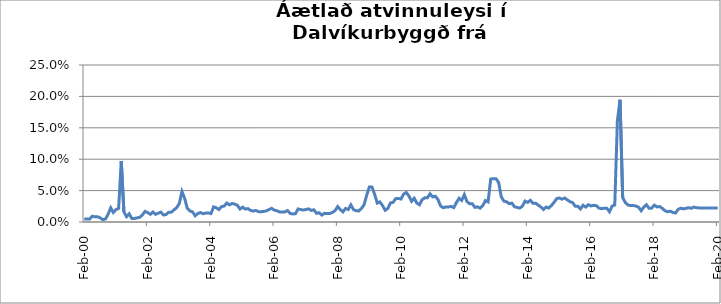
| Category | Series 0 |
|---|---|
| 2000-02-01 | 0.005 |
| 2000-03-01 | 0.005 |
| 2000-04-01 | 0.005 |
| 2000-05-01 | 0.009 |
| 2000-06-01 | 0.008 |
| 2000-07-01 | 0.008 |
| 2000-08-01 | 0.007 |
| 2000-09-01 | 0.004 |
| 2000-10-01 | 0.005 |
| 2000-11-01 | 0.012 |
| 2000-12-01 | 0.023 |
| 2001-01-01 | 0.015 |
| 2001-02-01 | 0.02 |
| 2001-03-01 | 0.022 |
| 2001-04-01 | 0.097 |
| 2001-05-01 | 0.016 |
| 2001-06-01 | 0.008 |
| 2001-07-01 | 0.013 |
| 2001-08-01 | 0.006 |
| 2001-09-01 | 0.006 |
| 2001-10-01 | 0.007 |
| 2001-11-01 | 0.007 |
| 2001-12-01 | 0.011 |
| 2002-01-01 | 0.017 |
| 2002-02-01 | 0.015 |
| 2002-03-01 | 0.012 |
| 2002-04-01 | 0.016 |
| 2002-05-01 | 0.012 |
| 2002-06-01 | 0.014 |
| 2002-07-01 | 0.016 |
| 2002-08-01 | 0.011 |
| 2002-09-01 | 0.012 |
| 2002-10-01 | 0.016 |
| 2002-11-01 | 0.016 |
| 2002-12-01 | 0.019 |
| 2003-01-01 | 0.023 |
| 2003-02-01 | 0.029 |
| 2003-03-01 | 0.049 |
| 2003-04-01 | 0.038 |
| 2003-05-01 | 0.022 |
| 2003-06-01 | 0.018 |
| 2003-07-01 | 0.016 |
| 2003-08-01 | 0.01 |
| 2003-09-01 | 0.013 |
| 2003-10-01 | 0.015 |
| 2003-11-01 | 0.013 |
| 2003-12-01 | 0.014 |
| 2004-01-01 | 0.014 |
| 2004-02-01 | 0.013 |
| 2004-03-01 | 0.024 |
| 2004-04-01 | 0.023 |
| 2004-05-01 | 0.02 |
| 2004-06-01 | 0.025 |
| 2004-07-01 | 0.025 |
| 2004-08-01 | 0.03 |
| 2004-09-01 | 0.027 |
| 2004-10-01 | 0.03 |
| 2004-11-01 | 0.029 |
| 2004-12-01 | 0.027 |
| 2005-01-01 | 0.021 |
| 2005-02-01 | 0.024 |
| 2005-03-01 | 0.021 |
| 2005-04-01 | 0.021 |
| 2005-05-01 | 0.018 |
| 2005-06-01 | 0.017 |
| 2005-07-01 | 0.018 |
| 2005-08-01 | 0.016 |
| 2005-09-01 | 0.016 |
| 2005-10-01 | 0.017 |
| 2005-11-01 | 0.018 |
| 2005-12-01 | 0.02 |
| 2006-01-01 | 0.022 |
| 2006-02-01 | 0.019 |
| 2006-03-01 | 0.018 |
| 2006-04-01 | 0.016 |
| 2006-05-01 | 0.016 |
| 2006-06-01 | 0.016 |
| 2006-07-01 | 0.018 |
| 2006-08-01 | 0.014 |
| 2006-09-01 | 0.013 |
| 2006-10-01 | 0.013 |
| 2006-11-01 | 0.021 |
| 2006-12-01 | 0.02 |
| 2007-01-01 | 0.019 |
| 2007-02-01 | 0.02 |
| 2007-03-01 | 0.021 |
| 2007-04-01 | 0.018 |
| 2007-05-01 | 0.019 |
| 2007-06-01 | 0.014 |
| 2007-07-01 | 0.015 |
| 2007-08-01 | 0.011 |
| 2007-09-01 | 0.014 |
| 2007-10-01 | 0.013 |
| 2007-11-01 | 0.013 |
| 2007-12-01 | 0.015 |
| 2008-01-01 | 0.018 |
| 2008-02-01 | 0.025 |
| 2008-03-01 | 0.02 |
| 2008-04-01 | 0.016 |
| 2008-05-01 | 0.022 |
| 2008-06-01 | 0.02 |
| 2008-07-01 | 0.027 |
| 2008-08-01 | 0.02 |
| 2008-09-01 | 0.018 |
| 2008-10-01 | 0.018 |
| 2008-11-01 | 0.022 |
| 2008-12-01 | 0.027 |
| 2009-01-01 | 0.043 |
| 2009-02-01 | 0.056 |
| 2009-03-01 | 0.056 |
| 2009-04-01 | 0.044 |
| 2009-05-01 | 0.03 |
| 2009-06-01 | 0.032 |
| 2009-07-01 | 0.026 |
| 2009-08-01 | 0.019 |
| 2009-09-01 | 0.022 |
| 2009-10-01 | 0.03 |
| 2009-11-01 | 0.031 |
| 2009-12-01 | 0.037 |
| 2010-01-01 | 0.038 |
| 2010-02-01 | 0.037 |
| 2010-03-01 | 0.044 |
| 2010-04-01 | 0.047 |
| 2010-05-01 | 0.041 |
| 2010-06-01 | 0.033 |
| 2010-07-01 | 0.038 |
| 2010-08-01 | 0.03 |
| 2010-09-01 | 0.027 |
| 2010-10-01 | 0.036 |
| 2010-11-01 | 0.038 |
| 2010-12-01 | 0.038 |
| 2011-01-01 | 0.045 |
| 2011-02-01 | 0.04 |
| 2011-03-01 | 0.041 |
| 2011-04-01 | 0.036 |
| 2011-05-01 | 0.026 |
| 2011-06-01 | 0.023 |
| 2011-07-01 | 0.024 |
| 2011-08-01 | 0.024 |
| 2011-09-01 | 0.025 |
| 2011-10-01 | 0.023 |
| 2011-11-01 | 0.031 |
| 2011-12-01 | 0.038 |
| 2012-01-01 | 0.034 |
| 2012-02-01 | 0.044 |
| 2012-03-01 | 0.032 |
| 2012-04-01 | 0.029 |
| 2012-05-01 | 0.029 |
| 2012-06-01 | 0.023 |
| 2012-07-01 | 0.024 |
| 2012-08-01 | 0.022 |
| 2012-09-01 | 0.026 |
| 2012-10-01 | 0.034 |
| 2012-11-01 | 0.032 |
| 2012-12-01 | 0.068 |
| 2013-01-01 | 0.069 |
| 2013-02-01 | 0.069 |
| 2013-03-01 | 0.063 |
| 2013-04-01 | 0.04 |
| 2013-05-01 | 0.033 |
| 2013-06-01 | 0.032 |
| 2013-07-01 | 0.029 |
| 2013-08-01 | 0.03 |
| 2013-09-01 | 0.024 |
| 2013-10-01 | 0.023 |
| 2013-11-01 | 0.022 |
| 2013-12-01 | 0.025 |
| 2014-01-01 | 0.033 |
| 2014-02-01 | 0.031 |
| 2014-03-01 | 0.034 |
| 2014-04-01 | 0.03 |
| 2014-05-01 | 0.03 |
| 2014-06-01 | 0.027 |
| 2014-07-01 | 0.024 |
| 2014-08-01 | 0.02 |
| 2014-09-01 | 0.024 |
| 2014-10-01 | 0.022 |
| 2014-11-01 | 0.026 |
| 2014-12-01 | 0.031 |
| 2015-01-01 | 0.037 |
| 2015-02-01 | 0.038 |
| 2015-03-01 | 0.036 |
| 2015-04-01 | 0.038 |
| 2015-05-01 | 0.035 |
| 2015-06-01 | 0.032 |
| 2015-07-01 | 0.031 |
| 2015-08-01 | 0.025 |
| 2015-09-01 | 0.025 |
| 2015-10-01 | 0.021 |
| 2015-11-01 | 0.027 |
| 2015-12-01 | 0.024 |
| 2016-01-01 | 0.028 |
| 2016-02-01 | 0.026 |
| 2016-03-01 | 0.027 |
| 2016-04-01 | 0.026 |
| 2016-05-01 | 0.022 |
| 2016-06-01 | 0.021 |
| 2016-07-01 | 0.022 |
| 2016-08-01 | 0.022 |
| 2016-09-01 | 0.016 |
| 2016-10-01 | 0.025 |
| 2016-11-01 | 0.027 |
| 2016-12-01 | 0.161 |
| 2017-01-01 | 0.195 |
| 2017-02-01 | 0.039 |
| 2017-03-01 | 0.031 |
| 2017-04-01 | 0.027 |
| 2017-05-01 | 0.026 |
| 2017-06-01 | 0.026 |
| 2017-07-01 | 0.025 |
| 2017-08-01 | 0.024 |
| 2017-09-01 | 0.018 |
| 2017-10-01 | 0.024 |
| 2017-11-01 | 0.028 |
| 2017-12-01 | 0.022 |
| 2018-01-01 | 0.022 |
| 2018-02-01 | 0.027 |
| 2018-03-01 | 0.024 |
| 2018-04-01 | 0.025 |
| 2018-05-01 | 0.022 |
| 2018-06-01 | 0.018 |
| 2018-07-01 | 0.016 |
| 2018-08-01 | 0.017 |
| 2018-09-01 | 0.015 |
| 2018-10-01 | 0.014 |
| 2018-11-01 | 0.02 |
| 2018-12-01 | 0.022 |
| 2019-01-01 | 0.021 |
| 2019-02-01 | 0.022 |
| 2019-03-01 | 0.023 |
| 2019-04-01 | 0.022 |
| 2019-05-01 | 0.024 |
| 2019-06-01 | 0.023 |
| 2019-07-01 | 0.022 |
| 2019-08-01 | 0.022 |
| 2019-09-01 | 0.022 |
| 2019-10-01 | 0.022 |
| 2019-11-01 | 0.022 |
| 2019-12-01 | 0.022 |
| 2020-01-01 | 0.022 |
| 2020-02-01 | 0.022 |